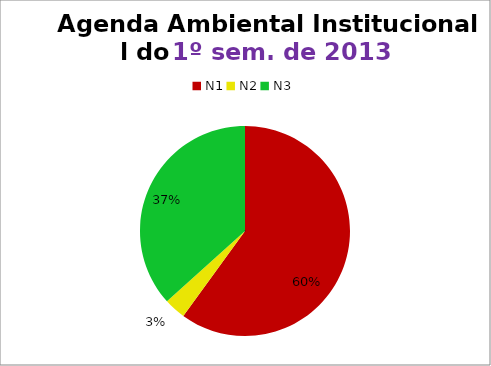
| Category | 1º/13 |
|---|---|
| N1 | 18 |
| N2 | 1 |
| N3 | 11 |